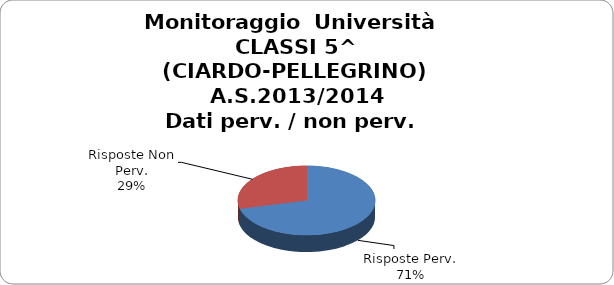
| Category | Series 0 | 71,05% 28,95% |
|---|---|---|
| 27.0 | 27 | 0.711 |
| 11.0 | 11 | 0.289 |